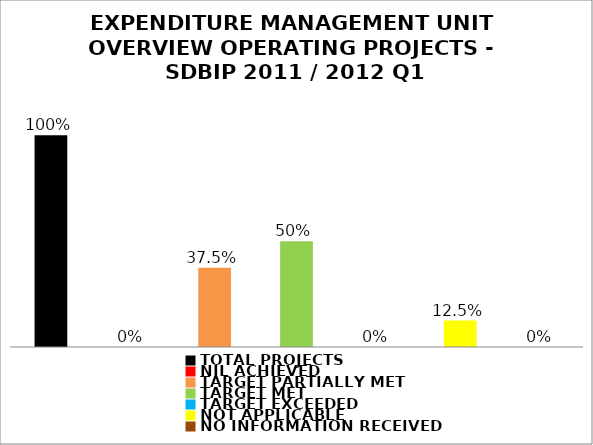
| Category | Series 0 |
|---|---|
| TOTAL PROJECTS | 1 |
| NIL ACHIEVED | 0 |
| TARGET PARTIALLY MET | 0.375 |
| TARGET MET | 0.5 |
| TARGET EXCEEDED | 0 |
| NOT APPLICABLE | 0.125 |
| NO INFORMATION RECEIVED | 0 |